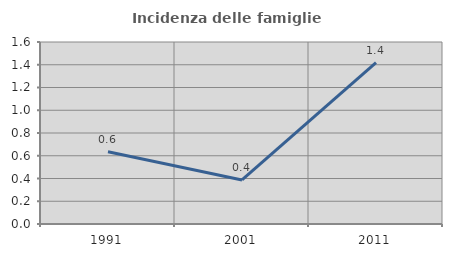
| Category | Incidenza delle famiglie numerose |
|---|---|
| 1991.0 | 0.636 |
| 2001.0 | 0.388 |
| 2011.0 | 1.42 |